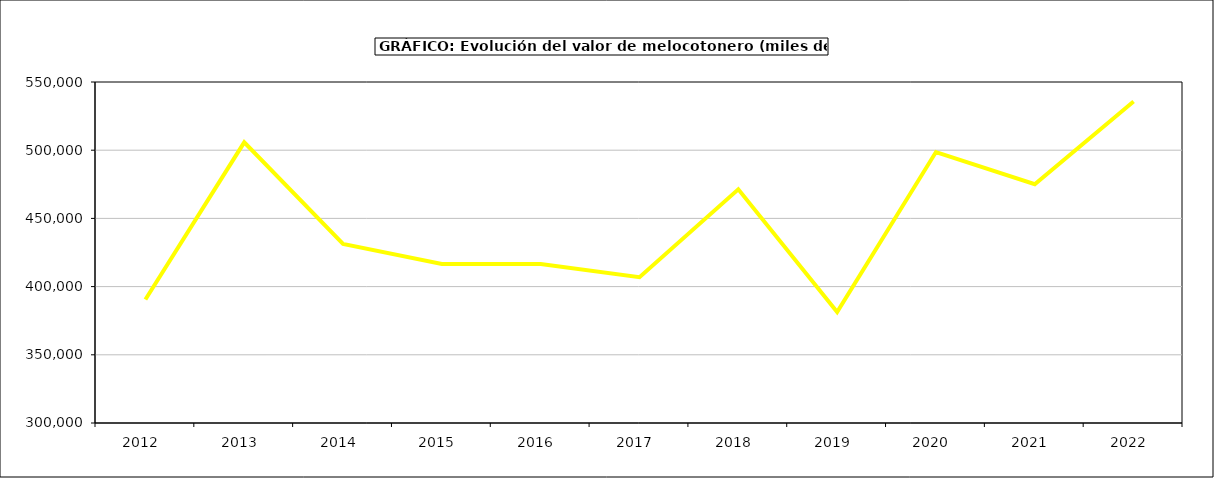
| Category | valor melocotonero |
|---|---|
| 2012.0 | 390522.664 |
| 2013.0 | 505779.721 |
| 2014.0 | 431268.365 |
| 2015.0 | 416638 |
| 2016.0 | 416500 |
| 2017.0 | 406839.379 |
| 2018.0 | 471336.394 |
| 2019.0 | 381426.562 |
| 2020.0 | 498667.723 |
| 2021.0 | 475032.012 |
| 2022.0 | 535685.295 |